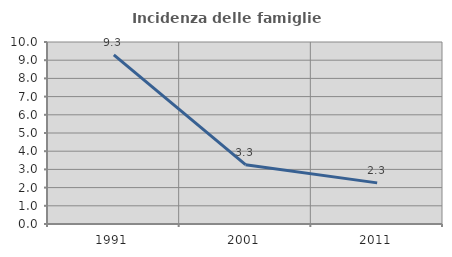
| Category | Incidenza delle famiglie numerose |
|---|---|
| 1991.0 | 9.29 |
| 2001.0 | 3.261 |
| 2011.0 | 2.26 |